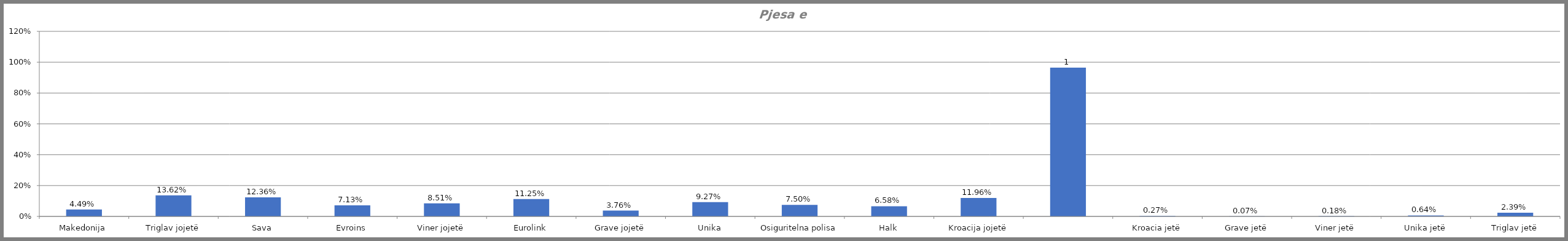
| Category | Series 0 |
|---|---|
| Makedonija | 0.045 |
| Triglav jojetë | 0.136 |
| Sava | 0.124 |
| Evroins | 0.071 |
| Viner jojetë | 0.085 |
| Eurolink | 0.113 |
| Grave jojetë | 0.038 |
| Unika | 0.093 |
| Osiguritelna polisa | 0.075 |
| Halk | 0.066 |
| Kroacija jojetë | 0.12 |
|  | 0.964 |
| Kroacia jetë | 0.003 |
| Grave jetë | 0.001 |
| Viner jetë | 0.002 |
| Unika jetë | 0.006 |
| Triglav jetë | 0.024 |